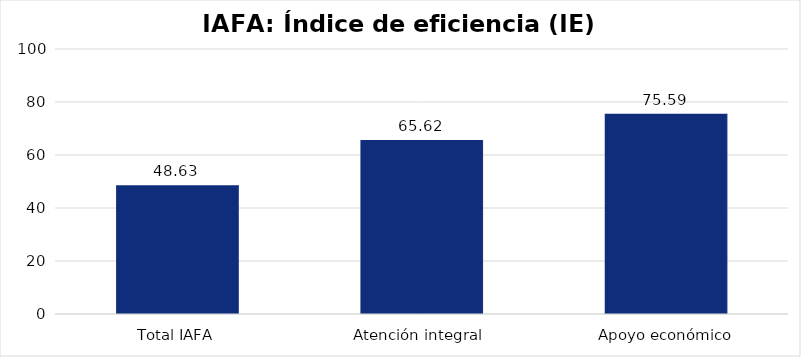
| Category | Índice de eficiencia (IE)  |
|---|---|
| Total IAFA | 48.63 |
| Atención integral  | 65.616 |
| Apoyo económico | 75.592 |